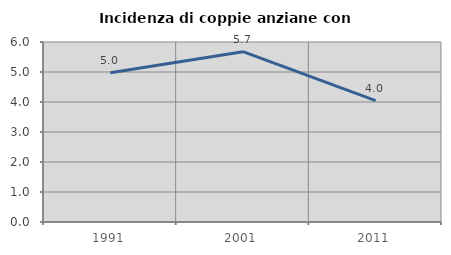
| Category | Incidenza di coppie anziane con figli |
|---|---|
| 1991.0 | 4.972 |
| 2001.0 | 5.678 |
| 2011.0 | 4.044 |